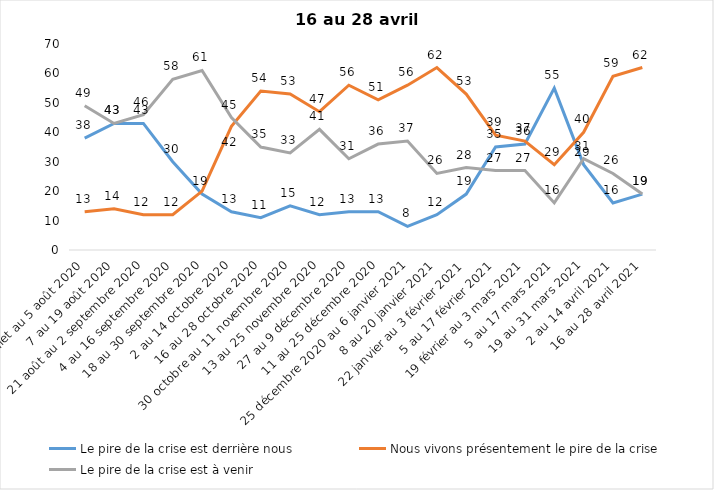
| Category | Le pire de la crise est derrière nous | Nous vivons présentement le pire de la crise | Le pire de la crise est à venir |
|---|---|---|---|
| 24 juillet au 5 août 2020 | 38 | 13 | 49 |
| 7 au 19 août 2020 | 43 | 14 | 43 |
| 21 août au 2 septembre 2020 | 43 | 12 | 46 |
| 4 au 16 septembre 2020 | 30 | 12 | 58 |
| 18 au 30 septembre 2020 | 19 | 20 | 61 |
| 2 au 14 octobre 2020 | 13 | 42 | 45 |
| 16 au 28 octobre 2020 | 11 | 54 | 35 |
| 30 octobre au 11 novembre 2020 | 15 | 53 | 33 |
| 13 au 25 novembre 2020 | 12 | 47 | 41 |
| 27 au 9 décembre 2020 | 13 | 56 | 31 |
| 11 au 25 décembre 2020 | 13 | 51 | 36 |
| 25 décembre 2020 au 6 janvier 2021 | 8 | 56 | 37 |
| 8 au 20 janvier 2021 | 12 | 62 | 26 |
| 22 janvier au 3 février 2021 | 19 | 53 | 28 |
| 5 au 17 février 2021 | 35 | 39 | 27 |
| 19 février au 3 mars 2021 | 36 | 37 | 27 |
| 5 au 17 mars 2021 | 55 | 29 | 16 |
| 19 au 31 mars 2021 | 29 | 40 | 31 |
| 2 au 14 avril 2021 | 16 | 59 | 26 |
| 16 au 28 avril 2021 | 19 | 62 | 19 |